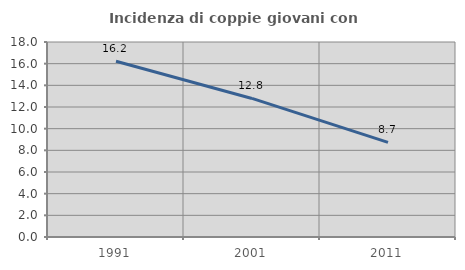
| Category | Incidenza di coppie giovani con figli |
|---|---|
| 1991.0 | 16.222 |
| 2001.0 | 12.791 |
| 2011.0 | 8.73 |